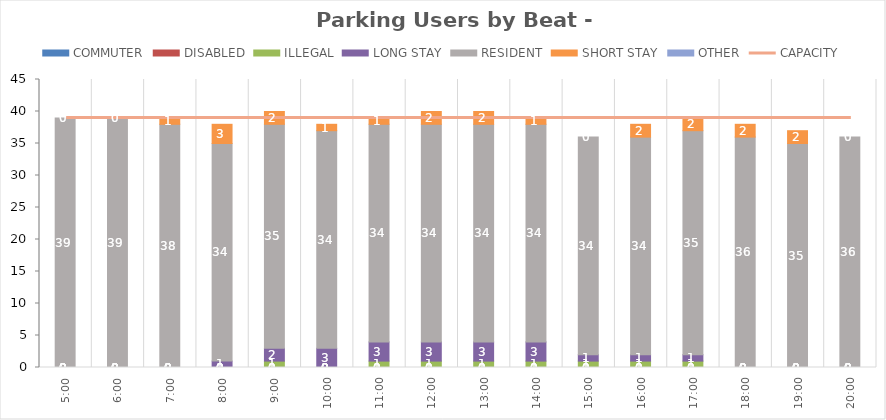
| Category | COMMUTER | DISABLED | ILLEGAL | LONG STAY | RESIDENT | SHORT STAY | OTHER |
|---|---|---|---|---|---|---|---|
| 0.20833333333333334 | 0 | 0 | 0 | 0 | 39 | 0 | 0 |
| 0.25 | 0 | 0 | 0 | 0 | 39 | 0 | 0 |
| 0.2916666666666667 | 0 | 0 | 0 | 0 | 38 | 1 | 0 |
| 0.3333333333333333 | 0 | 0 | 0 | 1 | 34 | 3 | 0 |
| 0.375 | 0 | 0 | 1 | 2 | 35 | 2 | 0 |
| 0.4166666666666667 | 0 | 0 | 0 | 3 | 34 | 1 | 0 |
| 0.4583333333333333 | 0 | 0 | 1 | 3 | 34 | 1 | 0 |
| 0.5 | 0 | 0 | 1 | 3 | 34 | 2 | 0 |
| 0.5416666666666666 | 0 | 0 | 1 | 3 | 34 | 2 | 0 |
| 0.5833333333333334 | 0 | 0 | 1 | 3 | 34 | 1 | 0 |
| 0.625 | 0 | 0 | 1 | 1 | 34 | 0 | 0 |
| 0.6666666666666666 | 0 | 0 | 1 | 1 | 34 | 2 | 0 |
| 0.7083333333333334 | 0 | 0 | 1 | 1 | 35 | 2 | 0 |
| 0.75 | 0 | 0 | 0 | 0 | 36 | 2 | 0 |
| 0.7916666666666666 | 0 | 0 | 0 | 0 | 35 | 2 | 0 |
| 0.8333333333333334 | 0 | 0 | 0 | 0 | 36 | 0 | 0 |